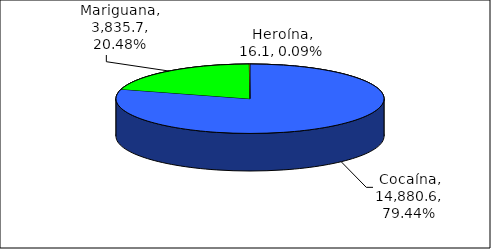
| Category | Kilos |
|---|---|
| Cocaína | 14880.6 |
| Mariguana | 3835.7 |
| Heroína | 16.1 |